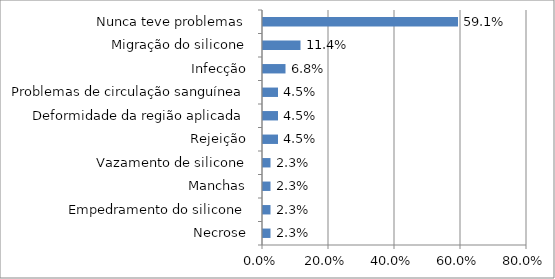
| Category | Series 0 |
|---|---|
| Necrose | 0.023 |
| Empedramento do silicone | 0.023 |
| Manchas | 0.023 |
| Vazamento de silicone | 0.023 |
| Rejeição | 0.045 |
| Deformidade da região aplicada | 0.045 |
| Problemas de circulação sanguínea | 0.045 |
| Infecção | 0.068 |
| Migração do silicone | 0.114 |
| Nunca teve problemas | 0.591 |